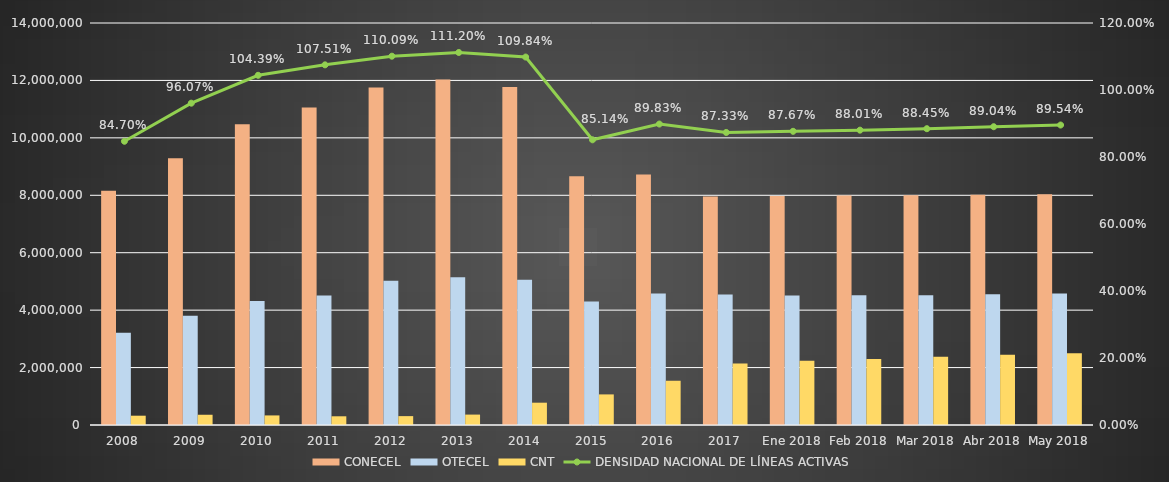
| Category | CONECEL | OTECEL | CNT |
|---|---|---|---|
| 2008 | 8156359 | 3211922 | 323967 |
| 2009 | 9291268 | 3806432 | 356900 |
| 2010 | 10470502 | 4314599 | 333730 |
| 2011 | 11057316 | 4513874 | 303368 |
| 2012 | 11757906 | 5019686 | 309271 |
| 2013 | 12030886 | 5148308 | 362560 |
| 2014 | 11772020 | 5055645 | 776892 |
| 2015 | 8658619 | 4303330 | 1065703 |
| 2016 | 8726823 | 4580092 | 1541219 |
| 2017 | 7960263 | 4549024 | 2142117 |
| Ene 2018 | 7976030 | 4513686 | 2236840 |
| Feb 2018 | 7989122 | 4515681 | 2297296 |
| Mar 2018 | 8000375 | 4515054 | 2378275 |
| Abr 2018 | 8016705 | 4551309 | 2443847 |
| May 2018 | 8036850 | 4582050 | 2495597 |